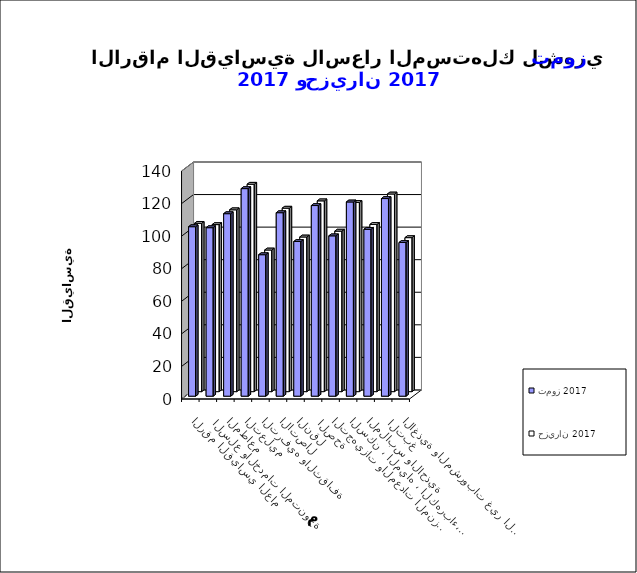
| Category | تموز 2017      | حزيران 2017       |
|---|---|---|
| الاغذية والمشروبات غير الكحولية | 94.4 | 94.6 |
|  التبغ | 121.4 | 121.4 |
| الملابس والاحذية | 102.5 | 102.7 |
| السكن ، المياه ، الكهرباء، الغاز  | 119.3 | 116.2 |
| التجهيزات والمعدات المنزلية والصيانة | 98.5 | 98.6 |
|  الصحة | 117.1 | 117.2 |
| النقل | 95 | 95 |
| الاتصال | 112.7 | 112.7 |
| الترفيه والثقافة | 86.9 | 87 |
| التعليم | 127.5 | 127.4 |
| المطاعم  | 112.1 | 111.7 |
|  السلع والخدمات المتنوعة | 103.5 | 102.6 |
| الرقم القياسي العام | 104.1 | 103.4 |